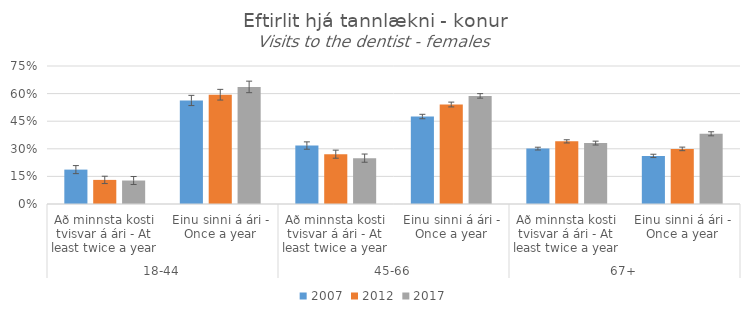
| Category | 2007 | 2012 | 2017 |
|---|---|---|---|
| 0 | 0.187 | 0.131 | 0.128 |
| 1 | 0.563 | 0.594 | 0.636 |
| 2 | 0.318 | 0.271 | 0.249 |
| 3 | 0.475 | 0.541 | 0.588 |
| 4 | 0.301 | 0.34 | 0.331 |
| 5 | 0.261 | 0.299 | 0.382 |